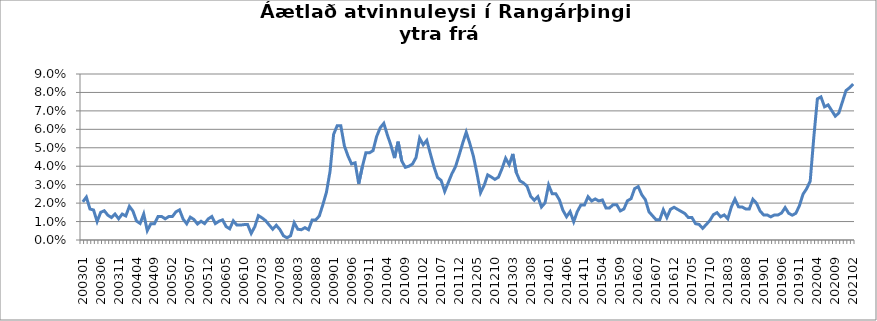
| Category | Series 0 |
|---|---|
| 200301 | 0.021 |
| 200302 | 0.023 |
| 200303 | 0.017 |
| 200304 | 0.016 |
| 200305 | 0.01 |
| 200306 | 0.015 |
| 200307 | 0.016 |
| 200308 | 0.013 |
| 200309 | 0.012 |
| 200310 | 0.014 |
| 200311 | 0.012 |
| 200312 | 0.014 |
| 200401 | 0.013 |
| 200402 | 0.018 |
| 200403 | 0.016 |
| 200404 | 0.01 |
| 200405 | 0.009 |
| 200406 | 0.014 |
| 200407 | 0.005 |
| 200408 | 0.009 |
| 200409 | 0.009 |
| 200410 | 0.013 |
| 200411 | 0.013 |
| 200412 | 0.011 |
| 200501 | 0.013 |
| 200502 | 0.013 |
| 200503 | 0.015 |
| 200504 | 0.016 |
| 200505 | 0.011 |
| 200506 | 0.009 |
| 200507 | 0.012 |
| 200508 | 0.011 |
| 200509 | 0.009 |
| 200510 | 0.01 |
| 200511 | 0.009 |
| 200512 | 0.011 |
| 200601 | 0.013 |
| 200602 | 0.009 |
| 200603 | 0.01 |
| 200604 | 0.011 |
| 200605 | 0.007 |
| 200606 | 0.006 |
| 200607 | 0.01 |
| 200608 | 0.008 |
| 200609 | 0.008 |
| 200610 | 0.008 |
| 200611 | 0.008 |
| 200612 | 0.004 |
| 200701 | 0.007 |
| 200702 | 0.013 |
| 200703 | 0.012 |
| 200704 | 0.011 |
| 200705 | 0.008 |
| 200706 | 0.006 |
| 200707 | 0.008 |
| 200708 | 0.006 |
| 200709 | 0.002 |
| 200710 | 0.001 |
| 200801 | 0.002 |
| 200802 | 0.009 |
| 200803 | 0.006 |
| 200804 | 0.006 |
| 200805 | 0.007 |
| 200806 | 0.006 |
| 200807 | 0.011 |
| 200808 | 0.011 |
| 200809 | 0.013 |
| 200810 | 0.019 |
| 200811 | 0.026 |
| 200812 | 0.037 |
| 200901 | 0.057 |
| 200902 | 0.062 |
| 200903 | 0.062 |
| 200904 | 0.051 |
| 200905 | 0.046 |
| 200906 | 0.041 |
| 200907 | 0.042 |
| 200908 | 0.031 |
| 200909 | 0.04 |
| 200910 | 0.047 |
| 200911 | 0.047 |
| 200912 | 0.048 |
| 201001 | 0.056 |
| 201002 | 0.061 |
| 201003 | 0.063 |
| 201004 | 0.057 |
| 201005 | 0.051 |
| 201006 | 0.044 |
| 201007 | 0.053 |
| 201008 | 0.043 |
| 201009 | 0.039 |
| 201010 | 0.04 |
| 201011 | 0.041 |
| 201012 | 0.045 |
| 201101 | 0.055 |
| 201102 | 0.052 |
| 201103 | 0.054 |
| 201104 | 0.047 |
| 201105 | 0.04 |
| 201106 | 0.034 |
| 201107 | 0.032 |
| 201108 | 0.026 |
| 201109 | 0.031 |
| 201110 | 0.036 |
| 201111 | 0.04 |
| 201112 | 0.046 |
| 201201 | 0.052 |
| 201202 | 0.058 |
| 201203 | 0.052 |
| 201204 | 0.045 |
| 201205 | 0.036 |
| 201206 | 0.026 |
| 201207 | 0.03 |
| 201208 | 0.035 |
| 201209 | 0.034 |
| 201210 | 0.033 |
| 201211 | 0.034 |
| 201212 | 0.039 |
| 201301 | 0.044 |
| 201302 | 0.041 |
| 201303 | 0.047 |
| 201304 | 0.036 |
| 201305 | 0.032 |
| 201306 | 0.031 |
| 201307 | 0.029 |
| 201308 | 0.024 |
| 201309 | 0.022 |
| 201310 | 0.023 |
| 201311 | 0.018 |
| 201312 | 0.02 |
| 201401 | 0.03 |
| 201402 | 0.025 |
| 201403 | 0.025 |
| 201404 | 0.022 |
| 201405 | 0.016 |
| 201406 | 0.013 |
| 201407 | 0.015 |
| 201408 | 0.01 |
| 201409 | 0.015 |
| 201410 | 0.019 |
| 201411 | 0.019 |
| 201412 | 0.023 |
| 201501 | 0.021 |
| 201502 | 0.022 |
| 201503 | 0.021 |
| 201504 | 0.022 |
| 201505 | 0.017 |
| 201506 | 0.017 |
| 201507 | 0.019 |
| 201508 | 0.019 |
| 201509 | 0.016 |
| 201510 | 0.017 |
| 201511 | 0.021 |
| 201512 | 0.022 |
| 201601 | 0.028 |
| 201602 | 0.029 |
| 201603 | 0.024 |
| 201604 | 0.022 |
| 201605 | 0.015 |
| 201606 | 0.013 |
| 201607 | 0.011 |
| 201608 | 0.011 |
| 201609 | 0.016 |
| 201610 | 0.012 |
| 201611 | 0.017 |
| 201612 | 0.018 |
| 201701 | 0.017 |
| 201702 | 0.015 |
| 201703 | 0.014 |
| 201704 | 0.012 |
| 201705 | 0.012 |
| 201706 | 0.009 |
| 201707 | 0.008 |
| 201708 | 0.006 |
| 201709 | 0.008 |
| 201710 | 0.011 |
| 201711 | 0.014 |
| 201712 | 0.015 |
| 201801 | 0.013 |
| 201802 | 0.014 |
| 201803 | 0.012 |
| 201804 | 0.018 |
| 201805 | 0.022 |
| 201806 | 0.018 |
| 201807 | 0.018 |
| 201808 | 0.017 |
| 201809 | 0.017 |
| 201810 | 0.022 |
| 201811 | 0.02 |
| 201812 | 0.016 |
| 201901 | 0.014 |
| 201902 | 0.014 |
| 201903 | 0.013 |
| 201904 | 0.014 |
| 201905 | 0.014 |
| 201906 | 0.015 |
| 201907 | 0.018 |
| 201908 | 0.014 |
| 201909 | 0.013 |
| 201910 | 0.015 |
| 201911 | 0.019 |
| 201912 | 0.025 |
| 202001 | 0.028 |
| 202002 | 0.032 |
| 202003 | 0.056 |
| 202004 | 0.077 |
| 202005 | 0.078 |
| 202006 | 0.072 |
| 202007 | 0.073 |
| 202008 | 0.07 |
| 202009 | 0.067 |
| 202010 | 0.069 |
| 202011 | 0.075 |
| 202012 | 0.081 |
| 202101 | 0.083 |
| 202102 | 0.085 |